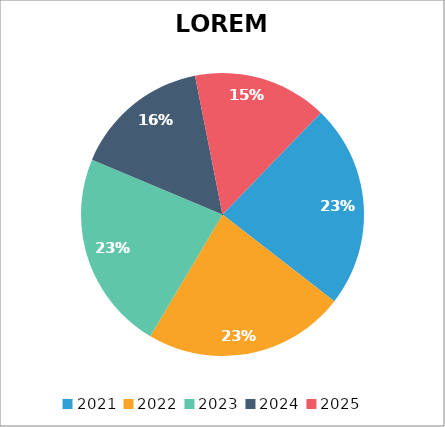
| Category | LOREM |
|---|---|
| 2021.0 | 150253 |
| 2022.0 | 148733 |
| 2023.0 | 147213 |
| 2024.0 | 100523 |
| 2025.0 | 99003 |